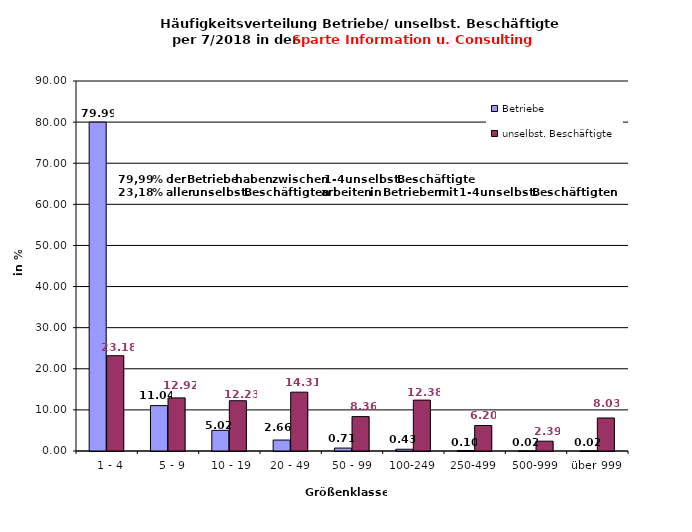
| Category | Betriebe | unselbst. Beschäftigte |
|---|---|---|
|   1 - 4 | 79.992 | 23.179 |
|   5 - 9 | 11.041 | 12.922 |
|  10 - 19 | 5.022 | 12.229 |
| 20 - 49 | 2.664 | 14.312 |
| 50 - 99 | 0.712 | 8.362 |
| 100-249 | 0.427 | 12.376 |
| 250-499 | 0.102 | 6.197 |
| 500-999 | 0.02 | 2.389 |
| über 999 | 0.02 | 8.033 |